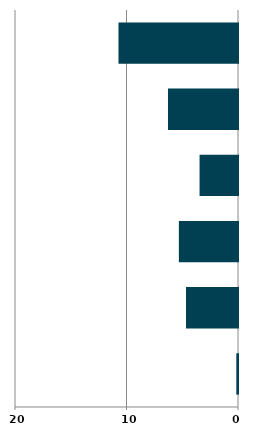
| Category | Series 0 |
|---|---|
| 0 | 0.152 |
| 1 | 4.662 |
| 2 | 5.304 |
| 3 | 3.447 |
| 4 | 6.28 |
| 5 | 10.719 |